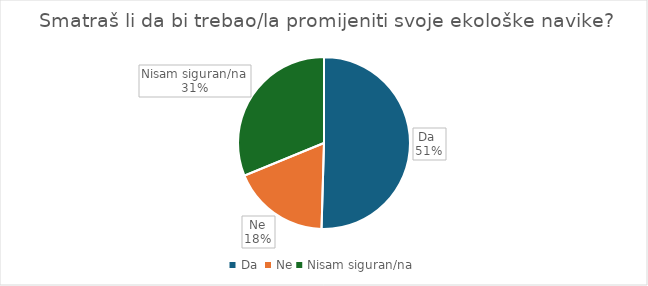
| Category | Series 0 |
|---|---|
| Da  | 55 |
| Ne | 20 |
| Nisam siguran/na | 34 |